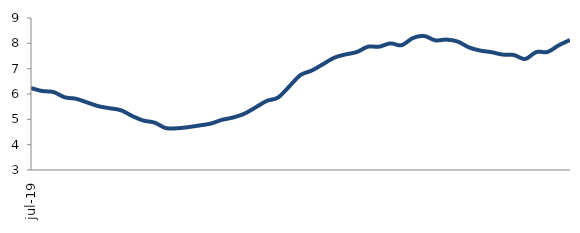
| Category | Series 0 |
|---|---|
| 2019-07-01 | 6.235 |
| 2019-08-01 | 6.117 |
| 2019-09-01 | 6.078 |
| 2019-10-01 | 5.87 |
| 2019-11-01 | 5.812 |
| 2019-12-01 | 5.666 |
| 2020-01-01 | 5.519 |
| 2020-02-01 | 5.438 |
| 2020-03-01 | 5.361 |
| 2020-04-01 | 5.136 |
| 2020-05-01 | 4.952 |
| 2020-06-01 | 4.871 |
| 2020-07-01 | 4.655 |
| 2020-08-01 | 4.647 |
| 2020-09-01 | 4.691 |
| 2020-10-01 | 4.759 |
| 2020-11-01 | 4.831 |
| 2020-12-01 | 4.978 |
| 2021-01-01 | 5.074 |
| 2021-02-01 | 5.222 |
| 2021-03-01 | 5.471 |
| 2021-04-01 | 5.728 |
| 2021-05-01 | 5.859 |
| 2021-06-01 | 6.298 |
| 2021-07-01 | 6.749 |
| 2021-08-01 | 6.925 |
| 2021-09-01 | 7.176 |
| 2021-10-01 | 7.432 |
| 2021-11-01 | 7.561 |
| 2021-12-01 | 7.654 |
| 2022-01-01 | 7.866 |
| 2022-02-01 | 7.867 |
| 2022-03-01 | 7.998 |
| 2022-04-01 | 7.924 |
| 2022-05-01 | 8.207 |
| 2022-06-01 | 8.291 |
| 2022-07-01 | 8.118 |
| 2022-08-01 | 8.148 |
| 2022-09-01 | 8.071 |
| 2022-10-01 | 7.84 |
| 2022-11-01 | 7.714 |
| 2022-12-01 | 7.652 |
| 2023-01-01 | 7.556 |
| 2023-02-01 | 7.538 |
| 2023-03-01 | 7.382 |
| 2023-04-01 | 7.655 |
| 2023-05-01 | 7.66 |
| 2023-06-01 | 7.922 |
| 2023-07-01 | 8.133 |